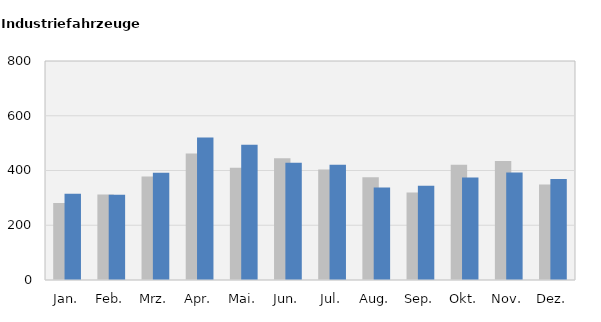
| Category | 2018 | 2019 |
|---|---|---|
| Jan. | 281 | 315 |
| Feb. | 312 | 311 |
| Mrz. | 378 | 392 |
| Apr. | 462 | 521 |
| Mai. | 410 | 494 |
| Jun. | 445 | 428 |
| Jul. | 404 | 421 |
| Aug. | 375 | 338 |
| Sep. | 320 | 344 |
| Okt. | 421 | 374 |
| Nov. | 435 | 393 |
| Dez. | 349 | 369 |